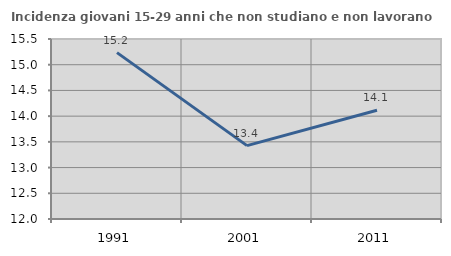
| Category | Incidenza giovani 15-29 anni che non studiano e non lavorano  |
|---|---|
| 1991.0 | 15.235 |
| 2001.0 | 13.427 |
| 2011.0 | 14.115 |